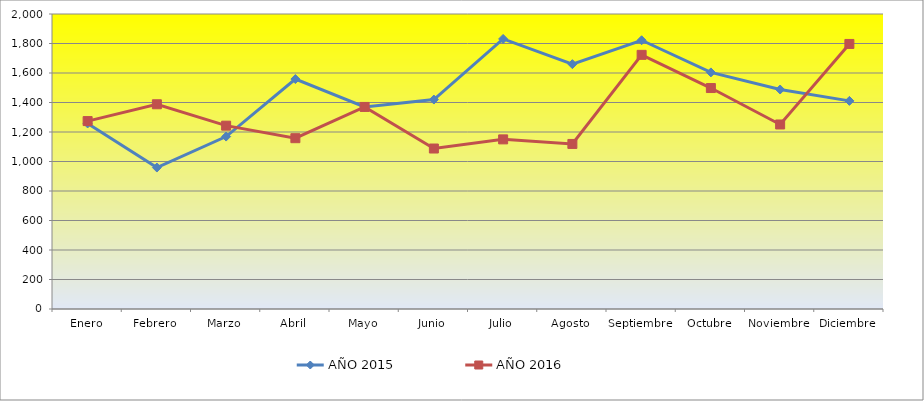
| Category | AÑO 2015 | AÑO 2016 |
|---|---|---|
| Enero | 1258 | 1274 |
| Febrero | 959 | 1388 |
| Marzo | 1169 | 1243 |
| Abril | 1559 | 1158 |
| Mayo | 1370 | 1370 |
| Junio | 1420 | 1088 |
| Julio | 1831 | 1150 |
| Agosto | 1660 | 1119 |
| Septiembre | 1822 | 1723 |
| Octubre | 1604 | 1498 |
| Noviembre | 1488 | 1251 |
| Diciembre | 1411 | 1797 |